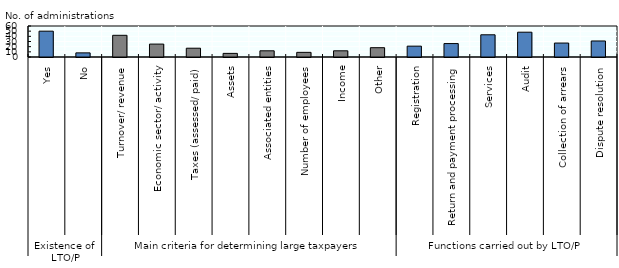
| Category | Series 0 |
|---|---|
| 0 | 50 |
| 1 | 8 |
| 2 | 42 |
| 3 | 25 |
| 4 | 17 |
| 5 | 7 |
| 6 | 12 |
| 7 | 9 |
| 8 | 12 |
| 9 | 18 |
| 10 | 21 |
| 11 | 26 |
| 12 | 43 |
| 13 | 48 |
| 14 | 27 |
| 15 | 31 |